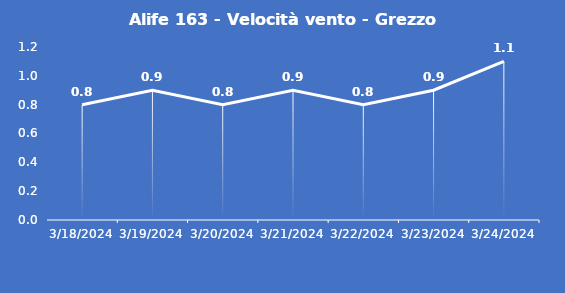
| Category | Alife 163 - Velocità vento - Grezzo (m/s) |
|---|---|
| 3/18/24 | 0.8 |
| 3/19/24 | 0.9 |
| 3/20/24 | 0.8 |
| 3/21/24 | 0.9 |
| 3/22/24 | 0.8 |
| 3/23/24 | 0.9 |
| 3/24/24 | 1.1 |